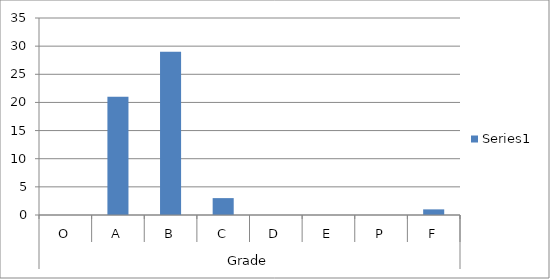
| Category | Series 0 |
|---|---|
| 0 | 0 |
| 1 | 21 |
| 2 | 29 |
| 3 | 3 |
| 4 | 0 |
| 5 | 0 |
| 6 | 0 |
| 7 | 1 |